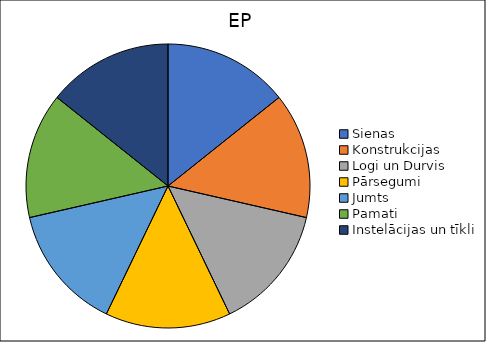
| Category | Series 0 |
|---|---|
| Sienas  | 0 |
| Konstrukcijas | 0 |
| Logi un Durvis | 0 |
| Pārsegumi | 0 |
| Jumts | 0 |
| Pamati | 0 |
| Instelācijas un tīkli | 0 |